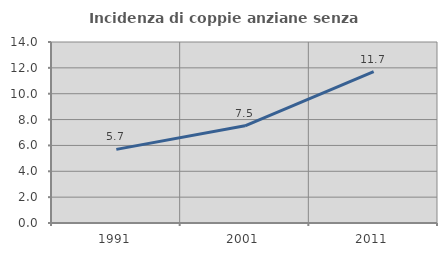
| Category | Incidenza di coppie anziane senza figli  |
|---|---|
| 1991.0 | 5.695 |
| 2001.0 | 7.52 |
| 2011.0 | 11.703 |